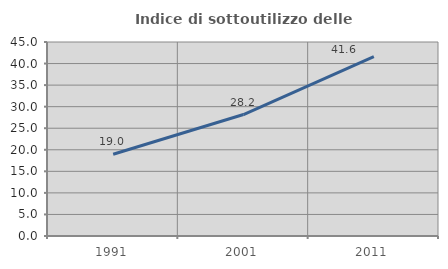
| Category | Indice di sottoutilizzo delle abitazioni  |
|---|---|
| 1991.0 | 18.962 |
| 2001.0 | 28.175 |
| 2011.0 | 41.6 |